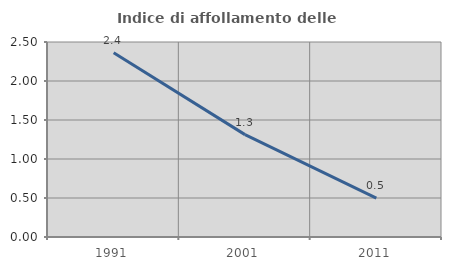
| Category | Indice di affollamento delle abitazioni  |
|---|---|
| 1991.0 | 2.363 |
| 2001.0 | 1.313 |
| 2011.0 | 0.498 |